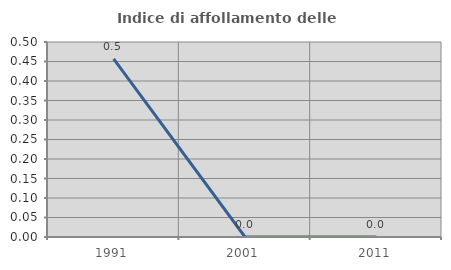
| Category | Indice di affollamento delle abitazioni  |
|---|---|
| 1991.0 | 0.457 |
| 2001.0 | 0 |
| 2011.0 | 0 |